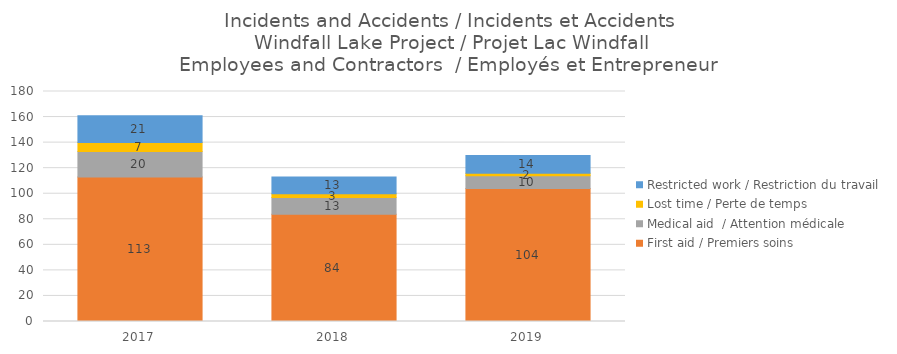
| Category | First aid / Premiers soins | Medical aid  / Attention médicale | Lost time / Perte de temps | Restricted work / Restriction du travail |
|---|---|---|---|---|
| 2017.0 | 113 | 20 | 7 | 21 |
| 2018.0 | 84 | 13 | 3 | 13 |
| 2019.0 | 104 | 10 | 2 | 14 |